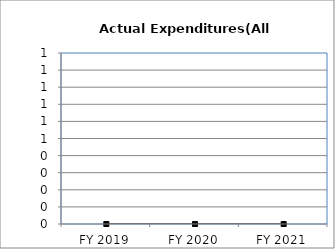
| Category | Actual Expenditures(All Funds) |
|---|---|
| FY 2019 | 0 |
| FY 2020 | 0 |
| FY 2021 | 0 |